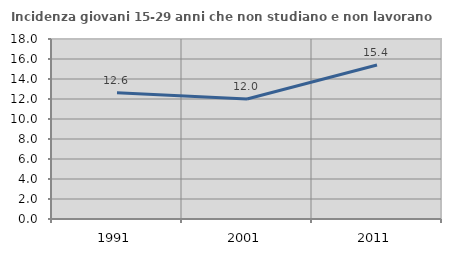
| Category | Incidenza giovani 15-29 anni che non studiano e non lavorano  |
|---|---|
| 1991.0 | 12.636 |
| 2001.0 | 12.007 |
| 2011.0 | 15.407 |